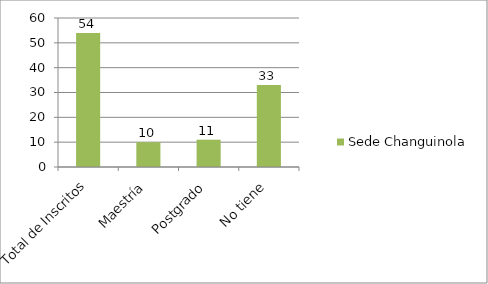
| Category | Sede Changuinola |
|---|---|
| Total de Inscritos | 54 |
| Maestría | 10 |
| Postgrado | 11 |
| No tiene | 33 |